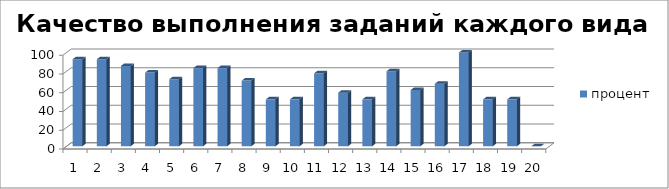
| Category | процент |
|---|---|
| 0 | 92.857 |
| 1 | 92.857 |
| 2 | 85.714 |
| 3 | 78.571 |
| 4 | 71.429 |
| 5 | 83.333 |
| 6 | 83.333 |
| 7 | 70 |
| 8 | 50 |
| 9 | 50 |
| 10 | 77.778 |
| 11 | 57.143 |
| 12 | 50 |
| 13 | 80 |
| 14 | 60 |
| 15 | 66.667 |
| 16 | 100 |
| 17 | 50 |
| 18 | 50 |
| 19 | 0 |